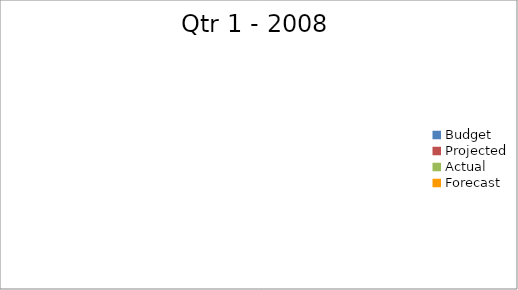
| Category | Series 0 |
|---|---|
| Budget | 2740 |
| Projected | 3470 |
| Actual | 2400 |
| Forecast | 1330 |